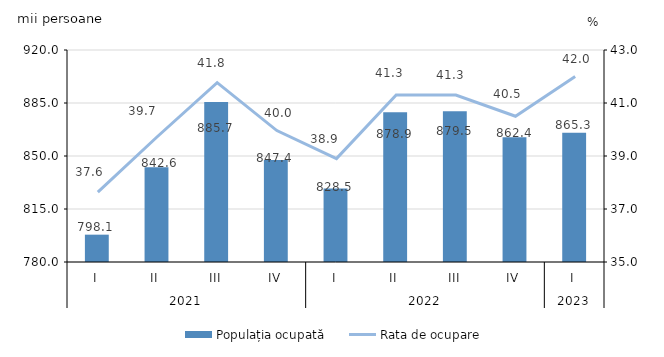
| Category | Populația ocupată |
|---|---|
| 0 | 798.054 |
| 1 | 842.611 |
| 2 | 885.715 |
| 3 | 847.401 |
| 4 | 828.5 |
| 5 | 878.9 |
| 6 | 879.5 |
| 7 | 862.4 |
| 8 | 865.3 |